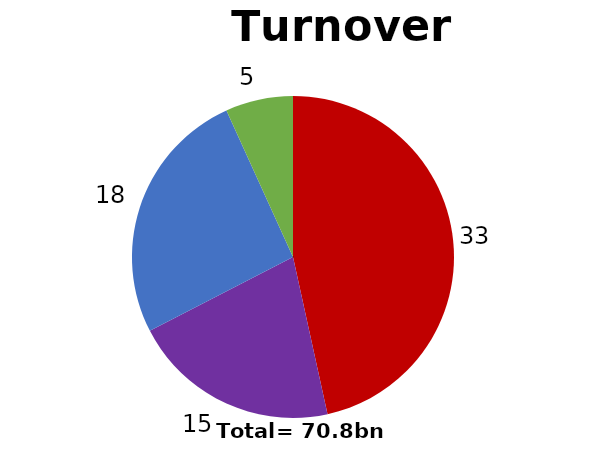
| Category | Series 0 |
|---|---|
| Biopharma core | 32.968 |
| Biopharma Service & Supply | 14.777 |
| Med Tech core | 18.262 |
| Med Tech Service & supply | 4.804 |